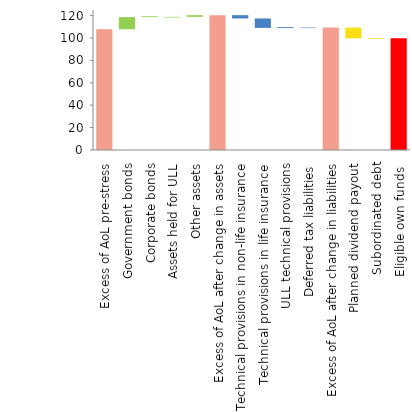
| Category | Series 0 | Series 1 |
|---|---|---|
| Excess of AoL pre-stress | 107.78 | 0 |
| Government bonds | 107.78 | 10.88 |
| Corporate bonds | 118.65 | 0.76 |
| Assets held for ULL | 118.34 | 0.54 |
| Other assets | 118.88 | 1.5 |
| Excess of AoL after change in assets | 0 | 120.38 |
| Technical provisions in non-life insurance | 117.46 | 2.92 |
| Technical provisions in life insurance | 109.02 | 8.44 |
| ULL technical provisions | 109.02 | 0.79 |
| Deferred tax liabilities | 108.85 | 0.48 |
| Excess of AoL after change in liabilities | 0 | 109.33 |
| Planned dividend payout | 99.69 | 9.63 |
| Subordinated debt | 99.14 | 0.56 |
| Eligible own funds  | 0 | 99.69 |